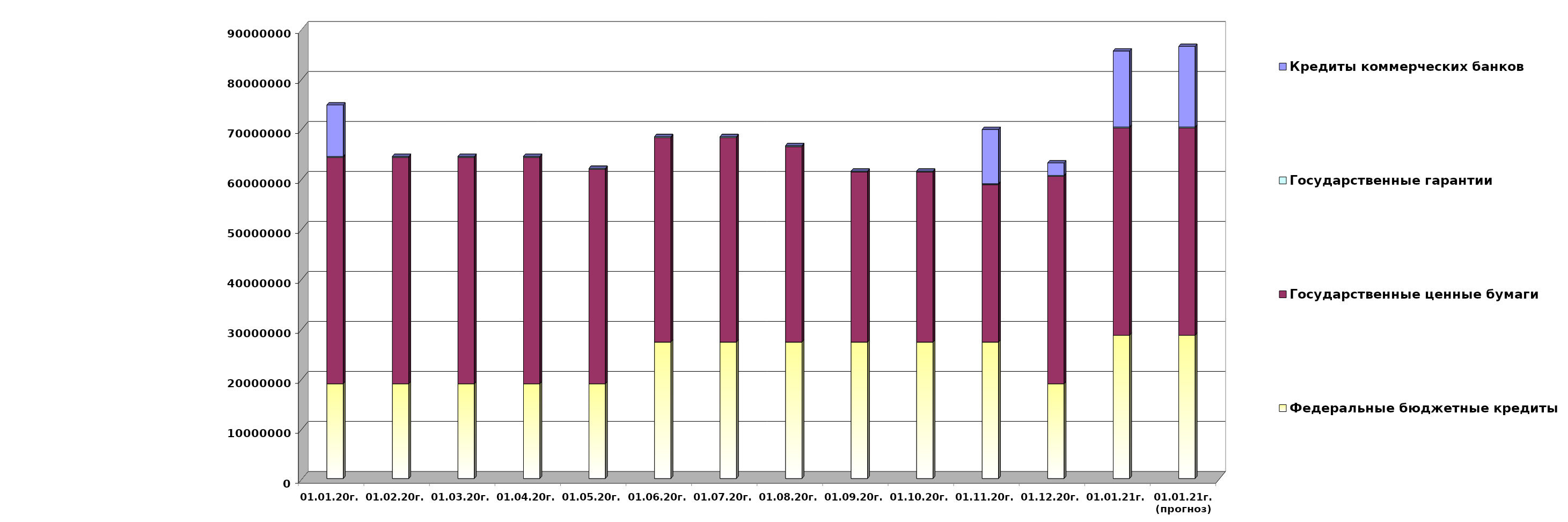
| Category | Федеральные бюджетные кредиты | Государственные ценные бумаги  | Государственные гарантии | Кредиты коммерческих банков |
|---|---|---|---|---|
| 01.01.20г. | 18954967.463 | 45300000 | 186330.02 | 10291177 |
| 01.02.20г. | 18954967.463 | 45300000 | 184738.25 | 0 |
| 01.03.20г. | 18954967.463 | 45300000 | 184738.25 | 0 |
| 01.04.20г. | 18954967.463 | 45300000 | 184738.25 | 0 |
| 01.05.20г. | 18954967.463 | 42900000 | 184738.25 | 0 |
| 01.06.20г. | 27303300.463 | 40900000 | 184738.25 | 0 |
| 01.07.20г. | 27303300.463 | 40900000 | 184738.25 | 0 |
| 01.08.20г. | 27303300.463 | 39100000 | 184738.25 | 0 |
| 01.09.20г. | 27303300.463 | 34000000 | 184738.25 | 0 |
| 01.10.20г. | 27303300.463 | 34000000 | 184738.25 | 0 |
| 01.11.20г. | 27303300.463 | 31500000 | 184738.25 | 10848333 |
| 01.12.20г. | 18954967.463 | 41500000 | 184738.25 | 2500000 |
| 01.01.21г. | 28654967.463 | 41500000 | 184738.25 | 15190000 |
| 01.01.21г.
(прогноз) | 28654967.5 | 41500000 | 184738.2 | 16107120.6 |